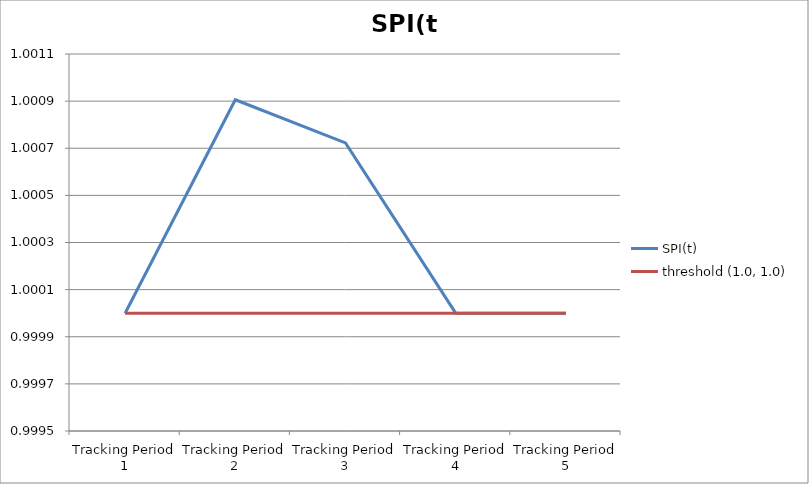
| Category | SPI(t) | threshold (1.0, 1.0) |
|---|---|---|
| Tracking Period 1 | 1 | 1 |
| Tracking Period 2 | 1.001 | 1 |
| Tracking Period 3 | 1.001 | 1 |
| Tracking Period 4 | 1 | 1 |
| Tracking Period 5 | 1 | 1 |